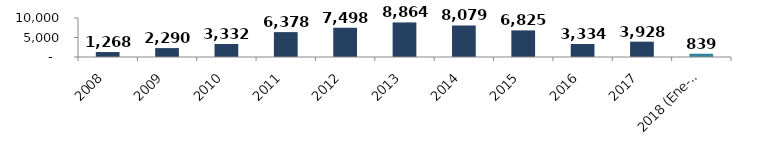
| Category | Series 0 |
|---|---|
| 0 | 1267.813 |
| 1 | 2290.273 |
| 2 | 3331.554 |
| 3 | 6377.615 |
| 4 | 7498.207 |
| 5 | 8863.622 |
| 6 | 8079.21 |
| 7 | 6824.624 |
| 8 | 3333.564 |
| 9 | 3928.017 |
| 10 | 839.273 |